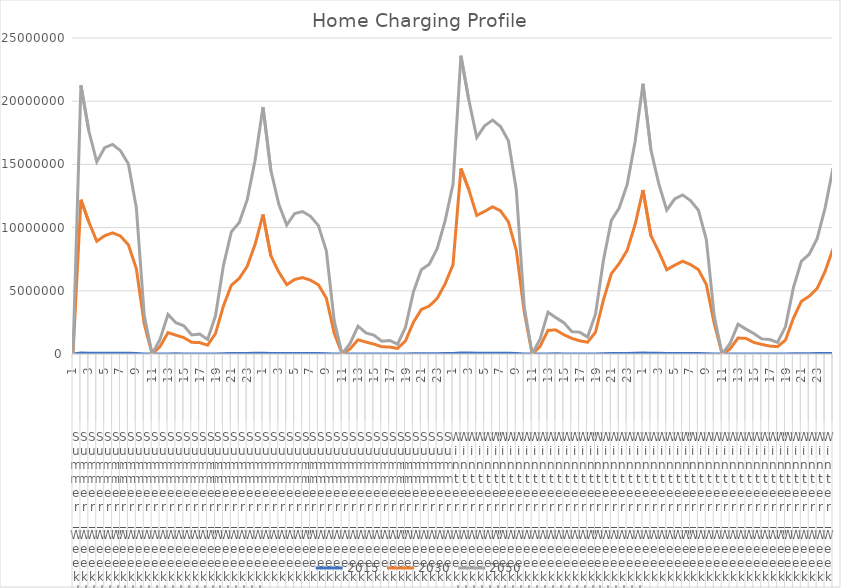
| Category | 2015 | 2030 | 2050 |
|---|---|---|---|
| 0 | 2015 | 2030 | 2050 |
| 1 | 73734 | 12204000 | 21260000 |
| 2 | 68760 | 10444000 | 17640000 |
| 3 | 56365 | 8919700 | 15201000 |
| 4 | 55746 | 9354300 | 16319000 |
| 5 | 59047 | 9582100 | 16582000 |
| 6 | 57548 | 9331300 | 16088000 |
| 7 | 54567 | 8632700 | 15024000 |
| 8 | 38234 | 6762400 | 11583000 |
| 9 | 9222.1 | 2379700 | 3044500 |
| 10 | 0 | 0 | 0 |
| 11 | 2131.5 | 595020 | 1164300 |
| 12 | 8262.6 | 1691900 | 3137400 |
| 13 | 10523 | 1489700 | 2478400 |
| 14 | 7682.2 | 1294000 | 2229500 |
| 15 | 6779.6 | 924970 | 1510200 |
| 16 | 5082.8 | 900860 | 1580400 |
| 17 | 5069.5 | 699840 | 1152900 |
| 18 | 7208.1 | 1616300 | 3023000 |
| 19 | 18983 | 3796000 | 6992400 |
| 20 | 30945 | 5434100 | 9664400 |
| 21 | 36111 | 5982100 | 10413000 |
| 22 | 40170 | 6931100 | 12192000 |
| 23 | 49724 | 8668100 | 15330000 |
| 24 | 63049 | 11032000 | 19534000 |
| 25 | 46098 | 7753700 | 14506000 |
| 26 | 43372 | 6478700 | 11837000 |
| 27 | 35618 | 5484300 | 10203000 |
| 28 | 34786 | 5895200 | 11118000 |
| 29 | 36886 | 6048800 | 11273000 |
| 30 | 36232 | 5840700 | 10894000 |
| 31 | 34481 | 5471700 | 10157000 |
| 32 | 24421 | 4425300 | 8168300 |
| 33 | 6529.6 | 1637900 | 2596500 |
| 34 | 0 | 0 | 0 |
| 35 | 1282.1 | 399830 | 831650 |
| 36 | 5040.8 | 1126800 | 2207700 |
| 37 | 6608.3 | 943250 | 1665700 |
| 38 | 4937 | 782450 | 1492100 |
| 39 | 4232.5 | 574040 | 1005200 |
| 40 | 3220.2 | 550680 | 1067300 |
| 41 | 3148.8 | 440460 | 772910 |
| 42 | 4467.1 | 1044400 | 2112100 |
| 43 | 11607 | 2512200 | 4903900 |
| 44 | 19222 | 3519100 | 6669000 |
| 45 | 22663 | 3792200 | 7096800 |
| 46 | 25154 | 4394300 | 8336200 |
| 47 | 30964 | 5544100 | 10527000 |
| 48 | 39285 | 7060600 | 13419000 |
| 49 | 83595 | 14675000 | 23602000 |
| 50 | 80850 | 13003000 | 20093000 |
| 51 | 68231 | 10964000 | 17133000 |
| 52 | 64771 | 11286000 | 18052000 |
| 53 | 67795 | 11646000 | 18501000 |
| 54 | 67287 | 11331000 | 17992000 |
| 55 | 60275 | 10453000 | 16869000 |
| 56 | 39833 | 8184600 | 12956000 |
| 57 | 9544.9 | 3323100 | 3712700 |
| 58 | 0 | 0 | 0 |
| 59 | 2163.5 | 598270 | 1168100 |
| 60 | 8431.1 | 1879600 | 3307800 |
| 61 | 11662 | 1897500 | 2876300 |
| 62 | 9761.8 | 1527900 | 2483300 |
| 63 | 7815.1 | 1241300 | 1772400 |
| 64 | 6416.3 | 1044900 | 1732300 |
| 65 | 5697.2 | 931100 | 1345100 |
| 66 | 8270.9 | 1727800 | 3145800 |
| 67 | 19761 | 4268600 | 7408800 |
| 68 | 33714 | 6352700 | 10558000 |
| 69 | 41130 | 7163500 | 11569000 |
| 70 | 46160 | 8203500 | 13405000 |
| 71 | 56014 | 10236000 | 16791000 |
| 72 | 70933 | 12975000 | 21378000 |
| 73 | 54888 | 9354700 | 16144000 |
| 74 | 54074 | 8091100 | 13463000 |
| 75 | 46155 | 6668400 | 11378000 |
| 76 | 43012 | 7024100 | 12261000 |
| 77 | 44755 | 7339700 | 12587000 |
| 78 | 44872 | 7076700 | 12141000 |
| 79 | 40250 | 6677200 | 11375000 |
| 80 | 27148 | 5497000 | 9056100 |
| 81 | 8168.9 | 2411600 | 2980300 |
| 82 | 0 | 0 | 0 |
| 83 | 1305.1 | 400780 | 834190 |
| 84 | 5211.5 | 1263000 | 2354600 |
| 85 | 7610.9 | 1235300 | 1967200 |
| 86 | 6705.4 | 915230 | 1618000 |
| 87 | 5245.6 | 759820 | 1195300 |
| 88 | 4359.3 | 627340 | 1139600 |
| 89 | 3772.6 | 581590 | 918600 |
| 90 | 5358.7 | 1104900 | 2171800 |
| 91 | 12377 | 2833200 | 5246700 |
| 92 | 21649 | 4163700 | 7339400 |
| 93 | 27058 | 4572800 | 7893200 |
| 94 | 30464 | 5188400 | 9142300 |
| 95 | 36618 | 6537600 | 11546000 |
| 96 | 46292 | 8314300 | 14704000 |